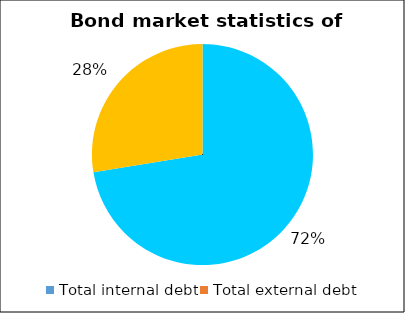
| Category | Series 1 | Series 0 |
|---|---|---|
| Total internal debt | 62.033 | 62.033 |
| Total external debt | 23.62 | 23.62 |